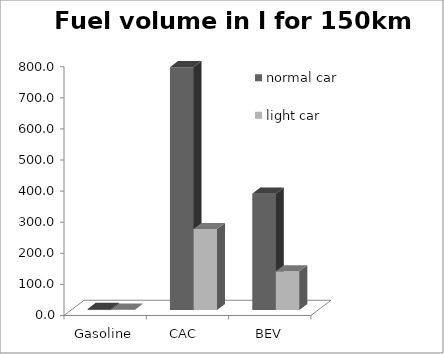
| Category | normal car | light car |
|---|---|---|
| Gasoline | 3.611 | 1.204 |
| CAC  | 781.196 | 260.399 |
| BEV | 374.171 | 124.724 |